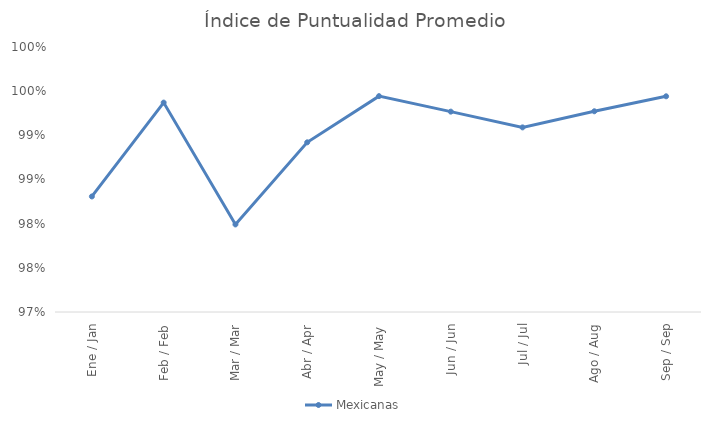
| Category | Mexicanas |
|---|---|
| Ene / Jan | 0.983 |
| Feb / Feb | 0.994 |
| Mar / Mar | 0.98 |
| Abr / Apr | 0.989 |
| May / May | 0.994 |
| Jun / Jun | 0.993 |
| Jul / Jul | 0.991 |
| Ago / Aug | 0.993 |
| Sep / Sep | 0.994 |